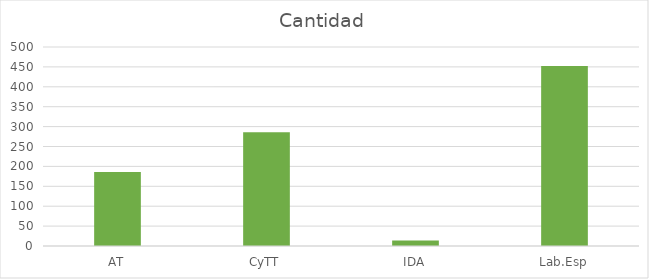
| Category | Cantidad |
|---|---|
| AT | 186 |
| CyTT | 286 |
| IDA | 14 |
| Lab.Esp | 452 |